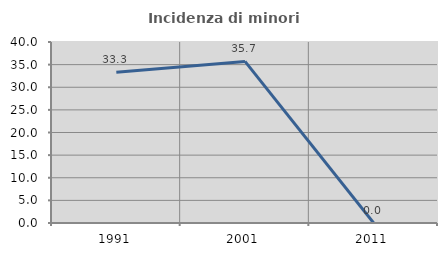
| Category | Incidenza di minori stranieri |
|---|---|
| 1991.0 | 33.333 |
| 2001.0 | 35.714 |
| 2011.0 | 0 |